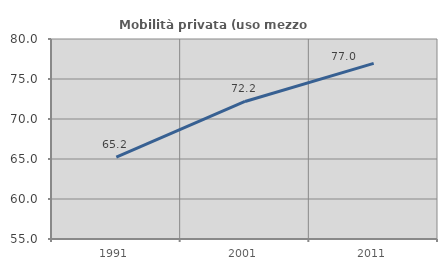
| Category | Mobilità privata (uso mezzo privato) |
|---|---|
| 1991.0 | 65.238 |
| 2001.0 | 72.195 |
| 2011.0 | 76.959 |